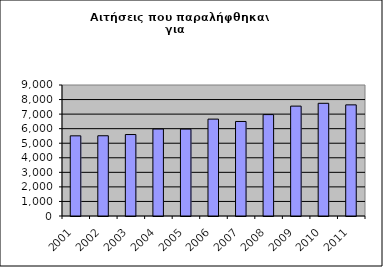
| Category | Series 1 |
|---|---|
| 2001.0 | 5507 |
| 2002.0 | 5513 |
| 2003.0 | 5597 |
| 2004.0 | 5974 |
| 2005.0 | 5970 |
| 2006.0 | 6656 |
| 2007.0 | 6494 |
| 2008.0 | 6966 |
| 2009.0 | 7549 |
| 2010.0 | 7742 |
| 2011.0 | 7635 |